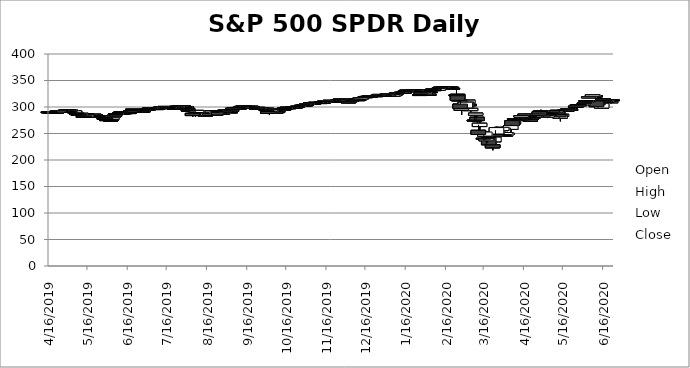
| Category | Open | High | Low | Close |
|---|---|---|---|---|
| 6/23/20 | 313.49 | 314.18 | 312.11 | 313.64 |
| 6/22/20 | 307.99 | 311.05 | 306.75 | 310.62 |
| 6/19/20 | 314.17 | 314.38 | 306.53 | 308.64 |
| 6/18/20 | 310.01 | 312.3 | 309.51 | 311.78 |
| 6/17/20 | 314.07 | 314.39 | 310.86 | 311.66 |
| 6/16/20 | 315.48 | 315.64 | 307.67 | 312.96 |
| 6/15/20 | 298.02 | 308.28 | 296.74 | 307.05 |
| 6/12/20 | 308.24 | 309.08 | 298.6 | 304.21 |
| 6/11/20 | 311.46 | 312.15 | 300.01 | 300.61 |
| 6/10/20 | 321.42 | 322.39 | 318.221 | 319 |
| 6/9/20 | 320.3 | 323.285 | 319.36 | 320.79 |
| 6/8/20 | 320.3 | 323.41 | 319.63 | 323.2 |
| 6/5/20 | 317.23 | 321.275 | 317.16 | 319.34 |
| 6/4/20 | 311.11 | 313 | 309.08 | 311.36 |
| 6/3/20 | 310.24 | 313.22 | 309.94 | 312.18 |
| 6/2/20 | 306.55 | 308.13 | 305.1 | 308.08 |
| 6/1/20 | 303.62 | 306.205 | 303.06 | 305.55 |
| 5/29/20 | 302.46 | 304.96 | 299.47 | 304.32 |
| 5/28/20 | 304.65 | 306.84 | 302.24 | 302.97 |
| 5/27/20 | 302.12 | 303.57 | 296.87 | 303.53 |
| 5/26/20 | 301.93 | 302.19 | 295.465 | 299.08 |
| 5/22/20 | 294.57 | 295.63 | 293.22 | 295.44 |
| 5/21/20 | 296.79 | 297.67 | 293.689 | 294.88 |
| 5/20/20 | 295.82 | 297.87 | 295.57 | 296.93 |
| 5/19/20 | 294.35 | 296.205 | 291.95 | 291.97 |
| 5/18/20 | 293.05 | 296.75 | 292.7 | 295 |
| 5/15/20 | 282.37 | 286.33 | 281.34 | 286.28 |
| 5/14/20 | 278.95 | 285.11 | 272.99 | 284.97 |
| 5/13/20 | 286.06 | 287.19 | 278.965 | 281.6 |
| 5/12/20 | 293.79 | 294.24 | 286.52 | 286.67 |
| 5/11/20 | 290.34 | 294 | 289.88 | 292.5 |
| 5/8/20 | 291.09 | 292.95 | 289.86 | 292.44 |
| 5/7/20 | 287.75 | 289.78 | 287.13 | 287.68 |
| 5/6/20 | 287.01 | 288.46 | 283.78 | 284.25 |
| 5/5/20 | 286.64 | 289.25 | 283.713 | 286.19 |
| 5/4/20 | 280.74 | 283.9 | 279.13 | 283.57 |
| 5/1/20 | 285.31 | 290.657 | 281.52 | 282.79 |
| 4/30/20 | 291.71 | 293.324 | 288.59 | 290.48 |
| 4/29/20 | 291.53 | 294.88 | 290.41 | 293.21 |
| 4/28/20 | 291.02 | 291.4 | 285.4 | 285.73 |
| 4/27/20 | 285.12 | 288.27 | 284.62 | 287.05 |
| 4/24/20 | 280.73 | 283.7 | 278.5 | 282.97 |
| 4/23/20 | 280.49 | 283.94 | 278.75 | 279.08 |
| 4/22/20 | 278.35 | 281 | 276.91 | 279.1 |
| 4/21/20 | 276.73 | 278.04 | 272.02 | 273.04 |
| 4/20/20 | 282.61 | 286.791 | 281.35 | 281.59 |
| 4/17/20 | 285.38 | 287.3 | 282.4 | 286.64 |
| 4/16/20 | 279.15 | 280.03 | 275.76 | 279.1 |
| 4/15/20 | 277.57 | 283.941 | 275.46 | 277.76 |
| 4/14/20 | 280.98 | 284.9 | 275.511 | 283.79 |
| 4/13/20 | 277.14 | 277.51 | 271.41 | 275.66 |
| 4/9/20 | 277.58 | 281.2 | 275.47 | 278.2 |
| 4/8/20 | 267.96 | 276 | 265.254 | 274.03 |
| 4/7/20 | 274.21 | 275.03 | 264.89 | 265.13 |
| 4/6/20 | 257.84 | 267 | 248.17 | 264.86 |
| 4/3/20 | 250.76 | 253.32 | 245.22 | 248.19 |
| 4/2/20 | 245.19 | 252.68 | 244.59 | 251.83 |
| 4/1/20 | 247.98 | 257.659 | 243.9 | 246.15 |
| 3/31/20 | 260.56 | 263.33 | 256.22 | 257.75 |
| 3/30/20 | 255.7 | 262.43 | 253.53 | 261.65 |
| 3/27/20 | 253.27 | 260.81 | 251.05 | 253.42 |
| 3/26/20 | 249.05 | 262.8 | 249.05 | 261.2 |
| 3/25/20 | 244.87 | 256.35 | 239.75 | 246.79 |
| 3/24/20 | 234.42 | 244.1 | 233.8 | 243.15 |
| 3/23/20 | 228.78 | 229.683 | 218.26 | 222.95 |
| 3/20/20 | 242.53 | 244.47 | 228.5 | 228.8 |
| 3/19/20 | 237.76 | 247.38 | 232.22 | 240.51 |
| 3/18/20 | 236.25 | 248.37 | 228.02 | 240 |
| 3/17/20 | 245.04 | 256.17 | 237.07 | 252.8 |
| 3/16/20 | 241.18 | 256.9 | 237.36 | 239.85 |
| 3/13/20 | 263.09 | 271.475 | 248.524 | 269.32 |
| 3/12/20 | 256 | 266.66 | 247.68 | 248.11 |
| 3/11/20 | 280.7 | 281.94 | 270.88 | 274.36 |
| 3/10/20 | 284.64 | 288.52 | 273.5 | 288.42 |
| 3/9/20 | 275.3 | 284.19 | 273.45 | 274.23 |
| 3/6/20 | 293.15 | 298.78 | 290.23 | 297.46 |
| 3/5/20 | 304.98 | 308.47 | 300.01 | 302.46 |
| 3/4/20 | 306.12 | 313.1 | 303.33 | 312.86 |
| 3/3/20 | 309.5 | 313.84 | 297.57 | 300.24 |
| 3/2/20 | 298.21 | 309.16 | 294.46 | 309.09 |
| 2/28/20 | 293.45 | 297.892 | 285.54 | 296.26 |
| 2/27/20 | 305.46 | 311.564 | 297.51 | 297.51 |
| 2/26/20 | 314.18 | 318.11 | 310.7 | 311.5 |
| 2/25/20 | 324.02 | 324.61 | 311.69 | 312.65 |
| 2/24/20 | 323.14 | 333.562 | 321.24 | 322.42 |
| 2/21/20 | 335.47 | 335.81 | 332.58 | 333.48 |
| 2/20/20 | 337.74 | 338.64 | 333.682 | 336.95 |
| 2/19/20 | 337.79 | 339.08 | 337.48 | 338.34 |
| 2/18/20 | 336.51 | 337.668 | 335.21 | 336.73 |
| 2/14/20 | 337.51 | 337.73 | 336.2 | 337.6 |
| 2/13/20 | 335.86 | 338.12 | 335.56 | 337.06 |
| 2/12/20 | 336.83 | 337.65 | 336.43 | 337.42 |
| 2/11/20 | 336.16 | 337.02 | 334.684 | 335.26 |
| 2/10/20 | 331.23 | 334.75 | 331.19 | 334.68 |
| 2/7/20 | 332.82 | 333.994 | 331.6 | 332.2 |
| 2/6/20 | 333.91 | 334.19 | 332.8 | 333.98 |
| 2/5/20 | 332.27 | 333.09 | 330.67 | 332.86 |
| 2/4/20 | 328.07 | 330.01 | 327.72 | 329.06 |
| 2/3/20 | 323.35 | 326.16 | 323.22 | 324.12 |
| 1/31/20 | 327 | 327.17 | 320.73 | 321.73 |
| 1/30/20 | 324.36 | 327.91 | 323.54 | 327.68 |
| 1/29/20 | 328.38 | 328.63 | 326.4 | 326.62 |
| 1/28/20 | 325.06 | 327.85 | 323.604 | 326.89 |
| 1/27/20 | 323.03 | 325.12 | 322.66 | 323.5 |
| 1/24/20 | 332.44 | 332.53 | 327.36 | 328.77 |
| 1/23/20 | 330.63 | 332.168 | 329.41 | 331.72 |
| 1/22/20 | 332.24 | 332.95 | 331.17 | 331.34 |
| 1/21/20 | 330.9 | 332.18 | 330.82 | 331.3 |
| 1/17/20 | 331.7 | 332.18 | 330.854 | 331.95 |
| 1/16/20 | 329.7 | 330.92 | 329.45 | 330.92 |
| 1/15/20 | 327.35 | 329.02 | 327.26 | 328.19 |
| 1/14/20 | 327.47 | 328.62 | 326.844 | 327.45 |
| 1/13/20 | 326.39 | 327.96 | 325.92 | 327.95 |
| 1/10/20 | 327.29 | 327.46 | 325.2 | 325.71 |
| 1/9/20 | 326.16 | 326.73 | 325.52 | 326.65 |
| 1/8/20 | 323.24 | 325.78 | 322.67 | 324.45 |
| 1/7/20 | 323.02 | 323.54 | 322.24 | 322.73 |
| 1/6/20 | 320.49 | 323.73 | 320.36 | 323.64 |
| 1/3/20 | 321.16 | 323.64 | 321.1 | 322.41 |
| 1/2/20 | 323.54 | 324.89 | 322.53 | 324.87 |
| 12/31/19 | 320.53 | 322.13 | 320.15 | 321.86 |
| 12/30/19 | 322.95 | 323.1 | 320.55 | 321.08 |
| 12/27/19 | 323.74 | 323.8 | 322.28 | 322.86 |
| 12/26/19 | 321.65 | 322.95 | 321.64 | 322.94 |
| 12/24/19 | 321.47 | 321.52 | 320.9 | 321.23 |
| 12/23/19 | 321.59 | 321.65 | 321.06 | 321.22 |
| 12/20/19 | 320.46 | 321.974 | 319.387 | 320.73 |
| 12/19/19 | 319.8 | 320.98 | 319.525 | 320.9 |
| 12/18/19 | 320 | 320.25 | 319.53 | 319.59 |
| 12/17/19 | 319.92 | 320.25 | 319.48 | 319.57 |
| 12/16/19 | 319.22 | 320.15 | 317.254 | 319.5 |
| 12/13/19 | 316.87 | 318.67 | 316.02 | 317.32 |
| 12/12/19 | 314.43 | 317.99 | 314.17 | 317.13 |
| 12/11/19 | 314.03 | 314.7 | 313.439 | 314.42 |
| 12/10/19 | 313.82 | 314.55 | 312.81 | 313.53 |
| 12/9/19 | 314.44 | 315.18 | 313.8 | 313.88 |
| 12/6/19 | 314.12 | 315.31 | 314.11 | 314.87 |
| 12/5/19 | 312.23 | 312.25 | 310.58 | 312.02 |
| 12/4/19 | 310.7 | 312.12 | 310.32 | 311.46 |
| 12/3/19 | 308.77 | 309.64 | 307.13 | 309.55 |
| 12/2/19 | 314.59 | 314.66 | 311.17 | 311.64 |
| 11/29/19 | 314.86 | 315.13 | 314.06 | 314.31 |
| 11/27/19 | 314.61 | 315.48 | 314.37 | 315.48 |
| 11/26/19 | 313.41 | 314.28 | 313.06 | 314.08 |
| 11/25/19 | 311.98 | 313.37 | 311.98 | 313.37 |
| 11/22/19 | 311.09 | 311.24 | 309.85 | 310.96 |
| 11/21/19 | 310.89 | 311.01 | 309.39 | 310.27 |
| 11/20/19 | 311.28 | 311.85 | 309.06 | 310.77 |
| 11/19/19 | 312.68 | 312.69 | 311.22 | 311.93 |
| 11/18/19 | 311.53 | 312.28 | 311.03 | 312.02 |
| 11/15/19 | 311.02 | 311.84 | 310.26 | 311.79 |
| 11/14/19 | 308.79 | 309.64 | 308.09 | 309.55 |
| 11/13/19 | 307.91 | 309.54 | 307.66 | 309.1 |
| 11/12/19 | 308.75 | 309.99 | 308.15 | 309 |
| 11/11/19 | 307.42 | 308.54 | 307.27 | 308.35 |
| 11/8/19 | 307.8 | 309.004 | 307.03 | 308.94 |
| 11/7/19 | 308.57 | 309.65 | 307.66 | 308.18 |
| 11/6/19 | 307.03 | 307.4 | 306.06 | 307.1 |
| 11/5/19 | 307.59 | 307.92 | 306.71 | 307.03 |
| 11/4/19 | 307.85 | 308 | 306.96 | 307.37 |
| 11/1/19 | 304.92 | 306.19 | 304.74 | 306.14 |
| 10/31/19 | 304.13 | 304.13 | 301.73 | 303.33 |
| 10/30/19 | 303.43 | 304.55 | 301.99 | 304.14 |
| 10/29/19 | 303 | 304.23 | 302.86 | 303.21 |
| 10/28/19 | 302.94 | 303.85 | 302.91 | 303.3 |
| 10/25/19 | 299.74 | 302.2 | 299.681 | 301.6 |
| 10/24/19 | 300.91 | 301.07 | 299.46 | 300.37 |
| 10/23/19 | 298.73 | 299.94 | 298.495 | 299.88 |
| 10/22/19 | 300.58 | 300.9 | 298.91 | 299.01 |
| 10/21/19 | 299.42 | 300.21 | 298.935 | 299.99 |
| 10/18/19 | 298.69 | 299.395 | 296.99 | 297.97 |
| 10/17/19 | 299.68 | 300.24 | 298.515 | 299.28 |
| 10/16/19 | 298.37 | 299.16 | 297.92 | 298.4 |
| 10/15/19 | 297.1 | 299.7 | 296.97 | 298.88 |
| 10/14/19 | 295.93 | 296.67 | 295.57 | 295.95 |
| 10/11/19 | 296.27 | 298.74 | 296.145 | 296.28 |
| 10/10/19 | 291.18 | 294.21 | 291 | 293.24 |
| 10/9/19 | 291.2 | 292.3 | 288.66 | 291.27 |
| 10/8/19 | 291.11 | 291.85 | 288.49 | 288.53 |
| 10/7/19 | 293.47 | 295.26 | 292.77 | 293.08 |
| 10/4/19 | 291.14 | 294.63 | 290.82 | 294.35 |
| 10/3/19 | 287.81 | 290.45 | 284.82 | 290.42 |
| 10/2/19 | 291.5 | 291.51 | 286.64 | 288.06 |
| 10/1/19 | 297.74 | 298.455 | 293 | 293.24 |
| 9/30/19 | 295.97 | 297.55 | 295.92 | 296.77 |
| 9/27/19 | 297.83 | 297.946 | 293.69 | 295.4 |
| 9/26/19 | 297.63 | 297.86 | 295.45 | 297 |
| 9/25/19 | 295.96 | 298.11 | 294.33 | 297.62 |
| 9/24/19 | 299.41 | 299.84 | 294.81 | 295.87 |
| 9/23/19 | 297.55 | 299 | 297.27 | 298.21 |
| 9/20/19 | 300.36 | 300.67 | 297.41 | 298.28 |
| 9/19/19 | 301.53 | 302.63 | 300.71 | 301.08 |
| 9/18/19 | 300.49 | 301.22 | 298.24 | 301.1 |
| 9/17/19 | 299.94 | 301.02 | 299.75 | 300.92 |
| 9/16/19 | 299.84 | 301.138 | 299.45 | 300.16 |
| 9/13/19 | 301.78 | 302.17 | 300.68 | 301.09 |
| 9/12/19 | 301.25 | 302.46 | 300.41 | 301.29 |
| 9/11/19 | 298.47 | 300.34 | 297.75 | 300.25 |
| 9/10/19 | 297.36 | 298.2 | 295.97 | 298.13 |
| 9/9/19 | 299.14 | 299.24 | 297.16 | 298.2 |
| 9/6/19 | 298.17 | 298.76 | 297.42 | 298.05 |
| 9/5/19 | 296.79 | 298.83 | 294.001 | 297.82 |
| 9/4/19 | 293.14 | 294.055 | 292.31 | 294.04 |
| 9/3/19 | 290.57 | 291.58 | 289.27 | 290.74 |
| 8/30/19 | 294.22 | 294.24 | 291.42 | 292.45 |
| 8/29/19 | 291.72 | 293.16 | 290.61 | 292.58 |
| 8/28/19 | 286.14 | 289.07 | 285.25 | 288.89 |
| 8/27/19 | 289.54 | 289.95 | 286.03 | 286.87 |
| 8/26/19 | 287.27 | 288 | 285.58 | 288 |
| 8/23/19 | 290.92 | 292.76 | 283.47 | 284.85 |
| 8/22/19 | 293.23 | 293.93 | 290.4 | 292.36 |
| 8/21/19 | 292.48 | 292.86 | 291.72 | 292.45 |
| 8/20/19 | 291.77 | 292.36 | 289.95 | 290.09 |
| 8/19/19 | 292.19 | 293.08 | 291.44 | 292.33 |
| 8/16/19 | 286.48 | 289.33 | 284.714 | 288.85 |
| 8/15/19 | 284.88 | 285.64 | 282.39 | 284.65 |
| 8/14/19 | 288.74 | 292.464 | 283.76 | 283.9 |
| 8/13/19 | 287.74 | 294.15 | 287.36 | 292.55 |
| 8/12/19 | 289.96 | 291.61 | 287.02 | 288.07 |
| 8/9/19 | 292.58 | 293.24 | 289.65 | 291.62 |
| 8/8/19 | 289.62 | 293.62 | 289.01 | 293.62 |
| 8/7/19 | 284.4 | 288.82 | 282.04 | 287.97 |
| 8/6/19 | 285.91 | 288.04 | 284.28 | 287.8 |
| 8/5/19 | 288.09 | 288.21 | 281.72 | 283.82 |
| 8/2/19 | 293.85 | 294.12 | 290.9 | 292.62 |
| 8/1/19 | 297.6 | 300.87 | 293.96 | 294.84 |
| 7/31/19 | 300.99 | 301.2 | 295.2 | 297.43 |
| 7/30/19 | 299.91 | 301.17 | 299.49 | 300.72 |
| 7/29/19 | 301.88 | 301.93 | 300.85 | 301.46 |
| 7/26/19 | 300.76 | 302.23 | 300.62 | 302.01 |
| 7/25/19 | 300.94 | 301 | 299.11 | 300 |
| 7/24/19 | 299.19 | 301.44 | 299.09 | 301.44 |
| 7/23/19 | 299.14 | 300.03 | 298.22 | 300.03 |
| 7/22/19 | 297.61 | 298.5 | 297.04 | 297.9 |
| 7/19/19 | 300.04 | 300.07 | 296.96 | 297.17 |
| 7/18/19 | 297.19 | 299.25 | 296.7 | 298.83 |
| 7/17/19 | 299.75 | 299.93 | 297.74 | 297.74 |
| 7/16/19 | 300.65 | 300.88 | 299.44 | 299.71 |
| 7/15/19 | 301.13 | 301.13 | 300.19 | 300.75 |
| 7/12/19 | 299.85 | 300.73 | 299.51 | 300.65 |
| 7/11/19 | 299.32 | 299.58 | 298.2 | 299.31 |
| 7/10/19 | 298.37 | 299.66 | 297.78 | 298.61 |
| 7/9/19 | 295.54 | 297.52 | 295.48 | 297.19 |
| 7/8/19 | 297.01 | 298.258 | 296.22 | 296.82 |
| 7/5/19 | 297.44 | 298.64 | 296.01 | 298.46 |
| 7/3/19 | 297.18 | 298.82 | 297.02 | 298.8 |
| 7/2/19 | 295.43 | 296.49 | 294.68 | 296.43 |
| 7/1/19 | 296.68 | 296.92 | 294.33 | 295.66 |
| 6/28/19 | 292.58 | 293.55 | 292.01 | 293 |
| 6/27/19 | 291.31 | 292.06 | 290.89 | 291.5 |
| 6/26/19 | 291.75 | 292.31 | 290.345 | 290.47 |
| 6/25/19 | 293.7 | 293.73 | 290.64 | 290.76 |
| 6/24/19 | 294.23 | 294.58 | 293.47 | 293.64 |
| 6/21/19 | 294.13 | 295.52 | 293.76 | 294 |
| 6/20/19 | 296.04 | 296.309 | 293.126 | 295.86 |
| 6/19/19 | 292.55 | 293.65 | 291.47 | 293.06 |
| 6/18/19 | 291.39 | 293.57 | 290.99 | 292.4 |
| 6/17/19 | 289.52 | 290.22 | 289.18 | 289.37 |
| 6/14/19 | 289.26 | 289.93 | 288.41 | 289.26 |
| 6/13/19 | 289.4 | 289.98 | 288.62 | 289.58 |
| 6/12/19 | 288.64 | 289.26 | 287.815 | 288.39 |
| 6/11/19 | 290.99 | 291.4 | 288.18 | 288.9 |
| 6/10/19 | 289.37 | 290.82 | 288.873 | 288.97 |
| 6/7/19 | 285.93 | 288.85 | 285.74 | 287.65 |
| 6/6/19 | 283.29 | 285.55 | 282.57 | 284.8 |
| 6/5/19 | 282.33 | 282.99 | 280.32 | 282.96 |
| 6/4/19 | 277.12 | 280.68 | 276.62 | 280.53 |
| 6/3/19 | 275.31 | 276.552 | 273.09 | 274.57 |
| 5/31/19 | 276.2 | 277.12 | 275.24 | 275.27 |
| 5/30/19 | 279.11 | 280.04 | 277.805 | 279.03 |
| 5/29/19 | 278.91 | 279.36 | 276.71 | 278.27 |
| 5/28/19 | 283.09 | 284.15 | 280.13 | 280.15 |
| 5/24/19 | 283.74 | 284.2 | 282.09 | 282.78 |
| 5/23/19 | 283.16 | 283.21 | 280.57 | 282.14 |
| 5/22/19 | 285.45 | 286.69 | 285.1 | 285.63 |
| 5/21/19 | 285.83 | 286.93 | 285.55 | 286.51 |
| 5/20/19 | 284.06 | 285.43 | 283.12 | 283.95 |
| 5/17/19 | 285.14 | 288.6 | 285.121 | 285.84 |
| 5/16/19 | 285.84 | 289.21 | 285.76 | 287.7 |
| 5/15/19 | 281.59 | 285.77 | 281.36 | 285.06 |
| 5/14/19 | 281.99 | 285.1 | 281.85 | 283.4 |
| 5/13/19 | 282.42 | 283.49 | 279.93 | 280.86 |
| 5/10/19 | 285.62 | 288.94 | 282.3 | 288.1 |
| 5/9/19 | 285.23 | 287.33 | 283.3 | 286.66 |
| 5/8/19 | 287.53 | 289.43 | 286.87 | 287.53 |
| 5/7/19 | 290.15 | 290.81 | 285.81 | 287.93 |
| 5/6/19 | 289.25 | 293.31 | 288.9 | 292.82 |
| 5/3/19 | 292.82 | 294.34 | 291.3 | 294.03 |
| 5/2/19 | 291.68 | 292.7 | 289.52 | 291.18 |
| 5/1/19 | 294.72 | 294.95 | 291.8 | 291.81 |
| 4/30/19 | 293.49 | 294.34 | 291.92 | 294.02 |
| 4/29/19 | 293.51 | 294.45 | 293.41 | 293.87 |
| 4/26/19 | 292.1 | 293.49 | 291.24 | 293.41 |
| 4/25/19 | 292.12 | 292.78 | 290.73 | 292.05 |
| 4/24/19 | 292.79 | 293.16 | 292.07 | 292.23 |
| 4/23/19 | 290.68 | 293.14 | 290.42 | 292.88 |
| 4/22/19 | 289.17 | 290.435 | 289.07 | 290.27 |
| 4/18/19 | 290.1 | 290.32 | 288.66 | 290.02 |
| 4/17/19 | 291.4 | 291.425 | 288.99 | 289.45 |
| 4/16/19 | 290.95 | 291.01 | 289.5 | 290.16 |